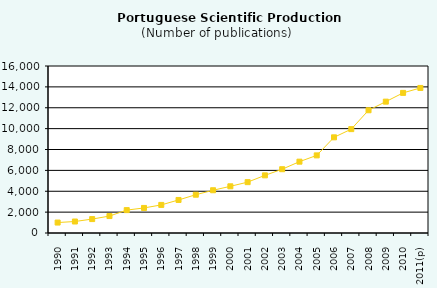
| Category | Total of Publications |
|---|---|
| 1990 | 1001 |
| 1991 | 1101 |
| 1992 | 1333 |
| 1993 | 1624 |
| 1994 | 2193 |
| 1995 | 2400 |
| 1996 | 2691 |
| 1997 | 3165 |
| 1998 | 3668 |
| 1999 | 4097 |
| 2000 | 4474 |
| 2001 | 4872 |
| 2002 | 5523 |
| 2003 | 6111 |
| 2004 | 6835 |
| 2005 | 7437 |
| 2006 | 9166 |
| 2007 | 9952 |
| 2008 | 11759 |
| 2009 | 12584 |
| 2010 | 13424 |
| 2011(p) | 13897 |